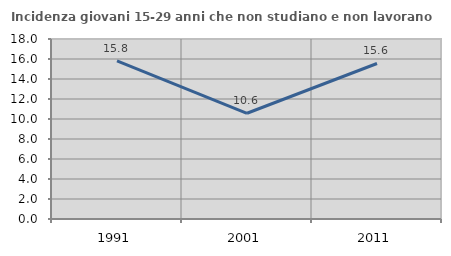
| Category | Incidenza giovani 15-29 anni che non studiano e non lavorano  |
|---|---|
| 1991.0 | 15.814 |
| 2001.0 | 10.573 |
| 2011.0 | 15.552 |